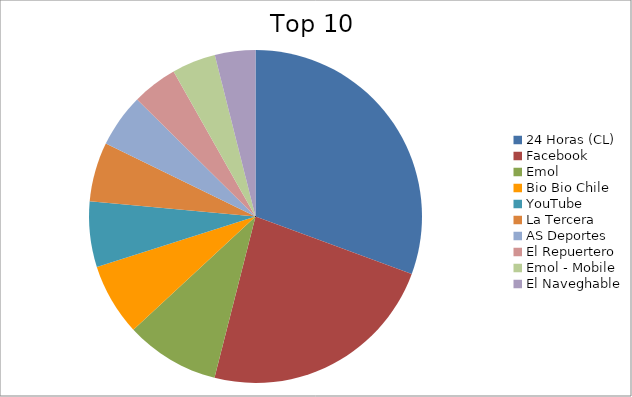
| Category | Series 0 |
|---|---|
| 24 Horas (CL) | 15.03 |
| Facebook | 11.46 |
| Emol | 4.49 |
| Bio Bio Chile | 3.43 |
| YouTube | 3.12 |
| La Tercera | 2.83 |
| AS Deportes | 2.55 |
| El Repuertero | 2.16 |
| Emol - Mobile | 2.09 |
| El Naveghable | 1.93 |